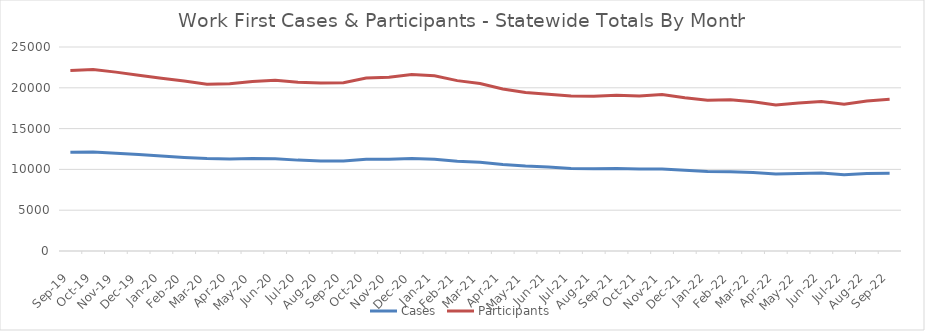
| Category | Cases | Participants |
|---|---|---|
| 2022-09-22 | 9528 | 18586 |
| 2022-08-22 | 9505 | 18379 |
| 2022-07-22 | 9349 | 17973 |
| 2022-06-22 | 9561 | 18334 |
| 2022-05-22 | 9493 | 18139 |
| 2022-04-22 | 9434 | 17898 |
| 2022-03-22 | 9625 | 18293 |
| 2022-02-22 | 9713 | 18537 |
| 2022-01-22 | 9733 | 18484 |
| 2021-12-21 | 9885 | 18776 |
| 2021-11-21 | 10056 | 19192 |
| 2021-10-21 | 10034 | 19005 |
| 2021-09-21 | 10102 | 19085 |
| 2021-08-21 | 10090 | 18974 |
| 2021-07-21 | 10121 | 18988 |
| 2021-06-21 | 10298 | 19211 |
| 2021-05-21 | 10411 | 19413 |
| 2021-04-21 | 10601 | 19845 |
| 2021-03-21 | 10888 | 20521 |
| 2021-02-21 | 11007 | 20877 |
| 2021-01-21 | 11252 | 21466 |
| 2020-12-20 | 11350 | 21641 |
| 2020-11-20 | 11255 | 21305 |
| 2020-10-20 | 11243 | 21198 |
| 2020-09-20 | 11030 | 20626 |
| 2020-08-20 | 11034 | 20575 |
| 2020-07-20 | 11137 | 20693 |
| 2020-06-20 | 11320 | 20921 |
| 2020-05-20 | 11330 | 20766 |
| 2020-04-20 | 11263 | 20490 |
| 2020-03-20 | 11330 | 20431 |
| 2020-02-20 | 11473 | 20821 |
| 2020-01-20 | 11654 | 21174 |
| 2019-12-19 | 11822 | 21539 |
| 2019-11-19 | 11990 | 21921 |
| 2019-10-19 | 12136 | 22233 |
| 2019-09-19 | 12092 | 22105 |